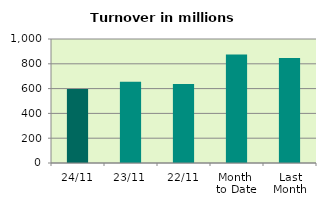
| Category | Series 0 |
|---|---|
| 24/11 | 597.578 |
| 23/11 | 656.004 |
| 22/11 | 636.191 |
| Month 
to Date | 874.223 |
| Last
Month | 847.422 |